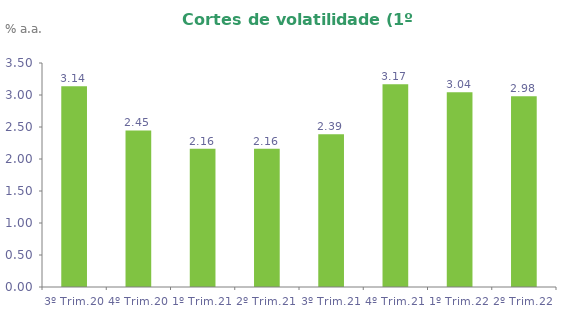
| Category | Series 0 |
|---|---|
| 3º Trim.20 | 3.137 |
| 4º Trim.20 | 2.447 |
| 1º Trim.21 | 2.162 |
| 2º Trim.21 | 2.162 |
| 3º Trim.21 | 2.387 |
| 4º Trim.21 | 3.166 |
| 1º Trim.22 | 3.042 |
| 2º Trim.22 | 2.981 |